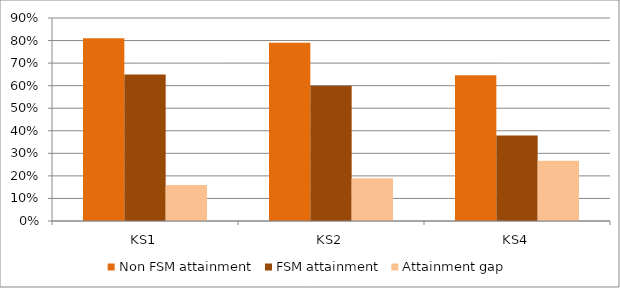
| Category | Non FSM attainment | FSM attainment | Attainment gap |
|---|---|---|---|
| KS1 | 0.81 | 0.65 | 0.16 |
| KS2 | 0.79 | 0.6 | 0.19 |
| KS4 | 0.646 | 0.379 | 0.267 |